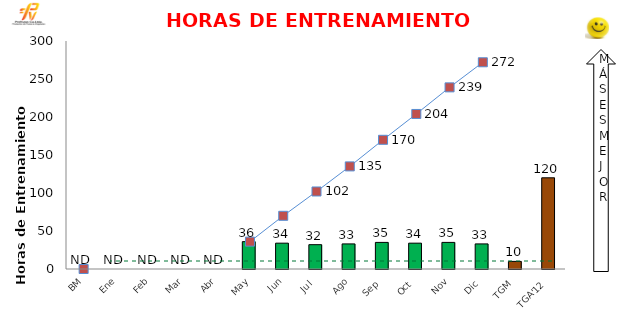
| Category | Series 0 |
|---|---|
| BM | 0 |
| Ene | 0 |
| Feb | 0 |
| Mar | 0 |
| Abr | 0 |
| May | 36 |
| Jun | 34 |
| Jul | 32 |
| Ago | 33 |
| Sep | 35 |
| Oct | 34 |
| Nov | 35 |
| Dic | 33 |
| TGM | 10 |
| TGA'12 | 120 |